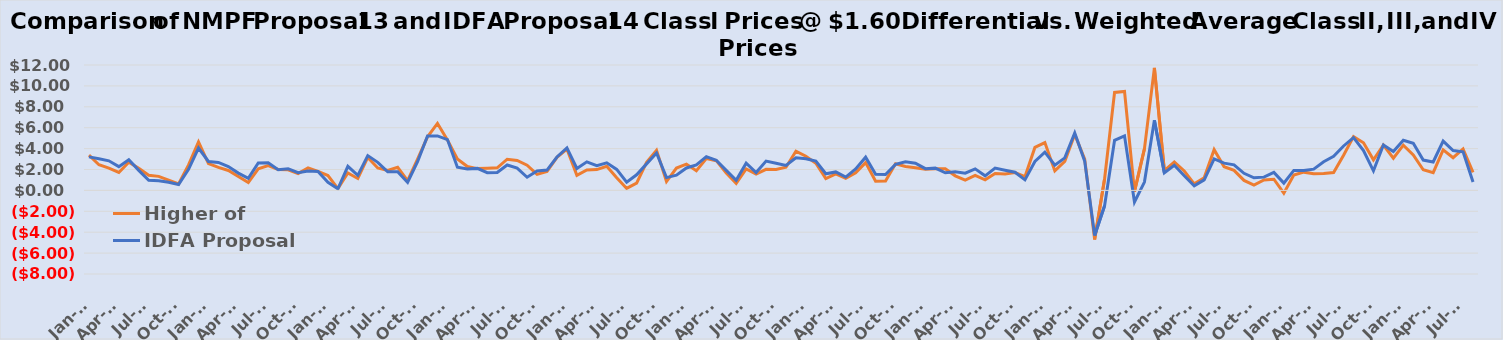
| Category | Higher of | IDFA Proposal  |
|---|---|---|
| 2012-01-01 | 3.38 | 3.21 |
| 2012-02-01 | 2.456 | 3.026 |
| 2012-03-01 | 2.133 | 2.833 |
| 2012-04-01 | 1.716 | 2.276 |
| 2012-05-01 | 2.702 | 2.942 |
| 2012-06-01 | 2.115 | 1.915 |
| 2012-07-01 | 1.44 | 0.96 |
| 2012-08-01 | 1.343 | 0.913 |
| 2012-09-01 | 0.983 | 0.773 |
| 2012-10-01 | 0.613 | 0.563 |
| 2012-11-01 | 2.437 | 2.017 |
| 2012-12-01 | 4.628 | 4.058 |
| 2013-01-01 | 2.566 | 2.766 |
| 2013-02-01 | 2.202 | 2.672 |
| 2013-03-01 | 1.908 | 2.278 |
| 2013-04-01 | 1.326 | 1.656 |
| 2013-05-01 | 0.751 | 1.151 |
| 2013-06-01 | 2.071 | 2.631 |
| 2013-07-01 | 2.378 | 2.638 |
| 2013-08-01 | 2.004 | 1.984 |
| 2013-09-01 | 1.968 | 2.078 |
| 2013-10-01 | 1.619 | 1.689 |
| 2013-11-01 | 2.154 | 1.854 |
| 2013-12-01 | 1.813 | 1.803 |
| 2014-01-01 | 1.422 | 0.782 |
| 2014-02-01 | 0.172 | 0.152 |
| 2014-03-01 | 1.661 | 2.301 |
| 2014-04-01 | 1.139 | 1.439 |
| 2014-05-01 | 3.151 | 3.331 |
| 2014-06-01 | 2.148 | 2.688 |
| 2014-07-01 | 1.912 | 1.782 |
| 2014-08-01 | 2.216 | 1.776 |
| 2014-09-01 | 0.938 | 0.758 |
| 2014-10-01 | 2.999 | 2.739 |
| 2014-11-01 | 5.13 | 5.2 |
| 2014-12-01 | 6.405 | 5.215 |
| 2015-01-01 | 4.835 | 4.865 |
| 2015-02-01 | 3.015 | 2.215 |
| 2015-03-01 | 2.283 | 2.043 |
| 2015-04-01 | 2.086 | 2.106 |
| 2015-05-01 | 2.126 | 1.696 |
| 2015-06-01 | 2.159 | 1.709 |
| 2015-07-01 | 2.985 | 2.435 |
| 2015-08-01 | 2.866 | 2.126 |
| 2015-09-01 | 2.41 | 1.26 |
| 2015-10-01 | 1.534 | 1.864 |
| 2015-11-01 | 1.813 | 1.943 |
| 2015-12-01 | 3.168 | 3.198 |
| 2016-01-01 | 3.954 | 4.064 |
| 2016-02-01 | 1.44 | 2.1 |
| 2016-03-01 | 1.953 | 2.733 |
| 2016-04-01 | 1.995 | 2.365 |
| 2016-05-01 | 2.312 | 2.642 |
| 2016-06-01 | 1.207 | 2.007 |
| 2016-07-01 | 0.187 | 0.787 |
| 2016-08-01 | 0.697 | 1.497 |
| 2016-09-01 | 2.678 | 2.538 |
| 2016-10-01 | 3.836 | 3.576 |
| 2016-11-01 | 0.847 | 1.227 |
| 2016-12-01 | 2.142 | 1.462 |
| 2017-01-01 | 2.516 | 2.146 |
| 2017-02-01 | 1.878 | 2.438 |
| 2017-03-01 | 3.042 | 3.232 |
| 2017-04-01 | 2.844 | 2.884 |
| 2017-05-01 | 1.663 | 1.913 |
| 2017-06-01 | 0.676 | 0.966 |
| 2017-07-01 | 2.06 | 2.61 |
| 2017-08-01 | 1.566 | 1.706 |
| 2017-09-01 | 2.015 | 2.805 |
| 2017-10-01 | 2 | 2.59 |
| 2017-11-01 | 2.221 | 2.391 |
| 2017-12-01 | 3.752 | 3.122 |
| 2018-01-01 | 3.267 | 3.027 |
| 2018-02-01 | 2.593 | 2.813 |
| 2018-03-01 | 1.133 | 1.593 |
| 2018-04-01 | 1.587 | 1.767 |
| 2018-05-01 | 1.157 | 1.277 |
| 2018-06-01 | 1.678 | 2.048 |
| 2018-07-01 | 2.656 | 3.176 |
| 2018-08-01 | 0.87 | 1.55 |
| 2018-09-01 | 0.89 | 1.52 |
| 2018-10-01 | 2.545 | 2.485 |
| 2018-11-01 | 2.297 | 2.747 |
| 2018-12-01 | 2.169 | 2.599 |
| 2019-01-01 | 2.019 | 2.079 |
| 2019-02-01 | 2.061 | 2.131 |
| 2019-03-01 | 2.076 | 1.686 |
| 2019-04-01 | 1.395 | 1.775 |
| 2019-05-01 | 0.988 | 1.648 |
| 2019-06-01 | 1.432 | 2.062 |
| 2019-07-01 | 1.013 | 1.393 |
| 2019-08-01 | 1.613 | 2.133 |
| 2019-09-01 | 1.576 | 1.936 |
| 2019-10-01 | 1.716 | 1.736 |
| 2019-11-01 | 1.309 | 1.009 |
| 2019-12-01 | 4.113 | 2.763 |
| 2020-01-01 | 4.573 | 3.663 |
| 2020-02-01 | 1.864 | 2.404 |
| 2020-03-01 | 2.773 | 3.113 |
| 2020-04-01 | 5.353 | 5.493 |
| 2020-05-01 | 2.998 | 2.798 |
| 2020-06-01 | -4.699 | -4.319 |
| 2020-07-01 | 1.12 | -1.46 |
| 2020-08-01 | 9.375 | 4.795 |
| 2020-09-01 | 9.473 | 5.223 |
| 2020-10-01 | -0.112 | -1.112 |
| 2020-11-01 | 3.978 | 0.798 |
| 2020-12-01 | 11.727 | 6.717 |
| 2021-01-01 | 1.883 | 1.673 |
| 2021-02-01 | 2.72 | 2.41 |
| 2021-03-01 | 1.856 | 1.396 |
| 2021-04-01 | 0.626 | 0.446 |
| 2021-05-01 | 1.201 | 1.011 |
| 2021-06-01 | 3.9 | 3.02 |
| 2021-07-01 | 2.269 | 2.609 |
| 2021-08-01 | 1.921 | 2.451 |
| 2021-09-01 | 0.955 | 1.635 |
| 2021-10-01 | 0.505 | 1.205 |
| 2021-11-01 | 1 | 1.27 |
| 2021-12-01 | 1.071 | 1.721 |
| 2022-01-01 | -0.265 | 0.695 |
| 2022-02-01 | 1.462 | 1.912 |
| 2022-03-01 | 1.746 | 1.916 |
| 2022-04-01 | 1.593 | 2.033 |
| 2022-05-01 | 1.617 | 2.737 |
| 2022-06-01 | 1.71 | 3.26 |
| 2022-07-01 | 3.371 | 4.251 |
| 2022-08-01 | 5.147 | 5.057 |
| 2022-09-01 | 4.56 | 3.82 |
| 2022-10-01 | 2.923 | 1.873 |
| 2022-11-01 | 4.342 | 4.352 |
| 2022-12-01 | 3.085 | 3.715 |
| 2023-01-01 | 4.325 | 4.795 |
| 2023-02-01 | 3.391 | 4.511 |
| 2023-03-01 | 1.973 | 2.903 |
| 2023-04-01 | 1.692 | 2.722 |
| 2023-05-01 | 3.883 | 4.723 |
| 2023-06-01 | 3.127 | 3.817 |
| 2023-07-01 | 3.964 | 3.694 |
| 2023-08-01 | 1.728 | 0.808 |